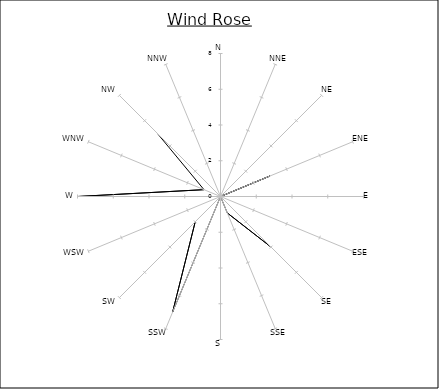
| Category | Series 0 |
|---|---|
| N | 0 |
| NNE | 0 |
| NE | 0 |
| ENE | 3 |
| E | 0 |
| ESE | 0 |
| SE | 4 |
| SSE | 1 |
| S | 0 |
| SSW | 7 |
| SW | 2 |
| WSW | 0 |
| W | 8 |
| WNW | 1 |
| NW | 5 |
| NNW | 0 |